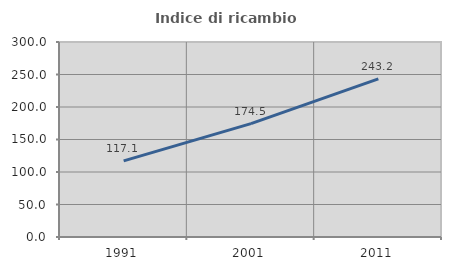
| Category | Indice di ricambio occupazionale  |
|---|---|
| 1991.0 | 117.052 |
| 2001.0 | 174.501 |
| 2011.0 | 243.239 |